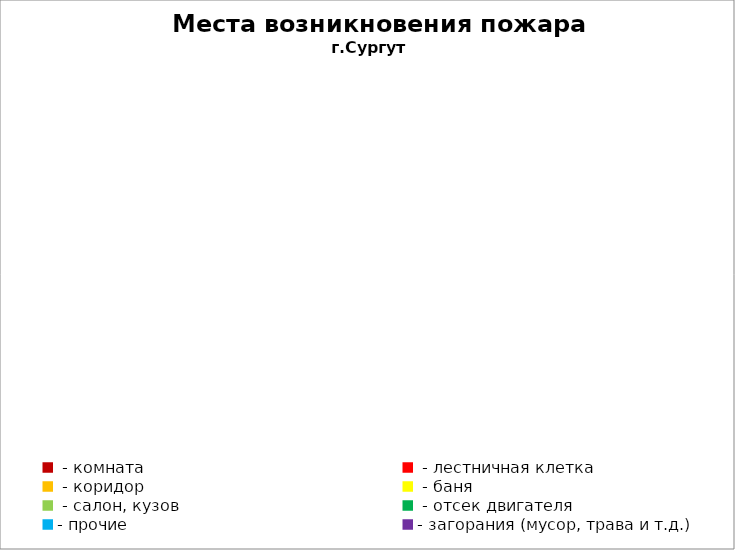
| Category | Места возникновения пожара |
|---|---|
|  - комната | 47 |
|  - лестничная клетка | 10 |
|  - коридор | 7 |
|  - баня | 45 |
|  - салон, кузов | 23 |
|  - отсек двигателя | 34 |
| - прочие | 108 |
| - загорания (мусор, трава и т.д.)  | 110 |